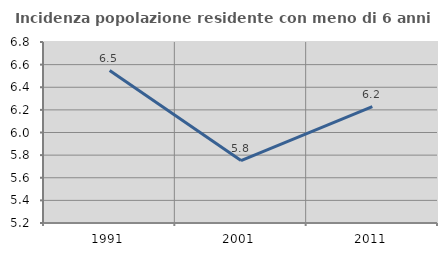
| Category | Incidenza popolazione residente con meno di 6 anni |
|---|---|
| 1991.0 | 6.548 |
| 2001.0 | 5.752 |
| 2011.0 | 6.229 |